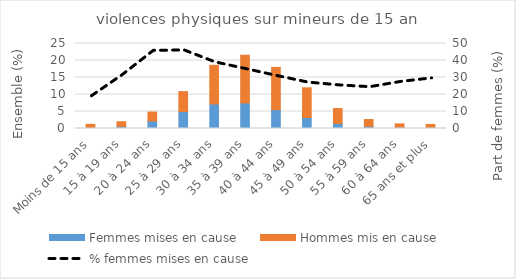
| Category | Femmes mises en cause | Hommes mis en cause |
|---|---|---|
| Moins de 15 ans | 0.23 | 0.983 |
| 15 à 19 ans | 0.626 | 1.363 |
| 20 à 24 ans | 2.211 | 2.63 |
| 25 à 29 ans | 4.979 | 5.866 |
| 30 à 34 ans | 7.221 | 11.348 |
| 35 à 39 ans | 7.521 | 14.024 |
| 40 à 44 ans | 5.547 | 12.419 |
| 45 à 49 ans | 3.232 | 8.734 |
| 50 à 54 ans | 1.49 | 4.38 |
| 55 à 59 ans | 0.641 | 1.996 |
| 60 à 64 ans | 0.372 | 0.987 |
| 65 ans et plus | 0.353 | 0.845 |